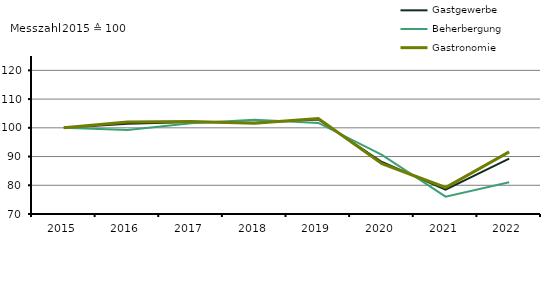
| Category | Gastgewerbe | Beherbergung | Gastronomie |
|---|---|---|---|
| 2015.0 | 100 | 100 | 100 |
| 2016.0 | 101.4 | 99.2 | 102 |
| 2017.0 | 102 | 101.6 | 102.2 |
| 2018.0 | 101.8 | 102.8 | 101.6 |
| 2019.0 | 102.9 | 101.7 | 103.2 |
| 2020.0 | 88.1 | 90.6 | 87.5 |
| 2021.0 | 78.462 | 76.032 | 79.217 |
| 2022.0 | 89.301 | 81.02 | 91.631 |